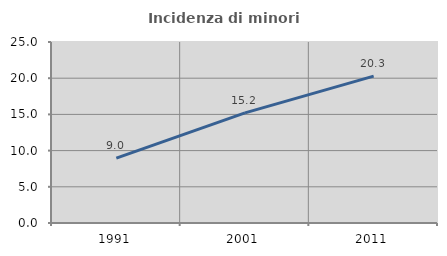
| Category | Incidenza di minori stranieri |
|---|---|
| 1991.0 | 8.956 |
| 2001.0 | 15.21 |
| 2011.0 | 20.281 |